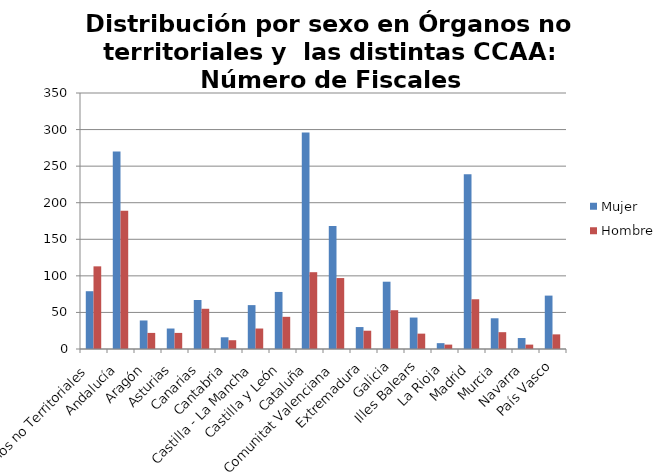
| Category | Mujer | Hombre |
|---|---|---|
| Órganos no Territoriales | 79 | 113 |
| Andalucía | 270 | 189 |
| Aragón | 39 | 22 |
| Asturias | 28 | 22 |
| Canarias | 67 | 55 |
| Cantabria | 16 | 12 |
| Castilla - La Mancha | 60 | 28 |
| Castilla y León | 78 | 44 |
| Cataluña | 296 | 105 |
| Comunitat Valenciana | 168 | 97 |
| Extremadura | 30 | 25 |
| Galicia | 92 | 53 |
| Illes Balears | 43 | 21 |
| La Rioja | 8 | 6 |
| Madrid | 239 | 68 |
| Murcia | 42 | 23 |
| Navarra | 15 | 6 |
| País Vasco | 73 | 20 |